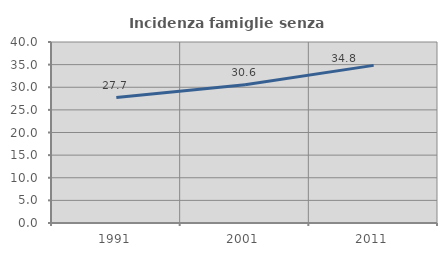
| Category | Incidenza famiglie senza nuclei |
|---|---|
| 1991.0 | 27.717 |
| 2001.0 | 30.575 |
| 2011.0 | 34.833 |